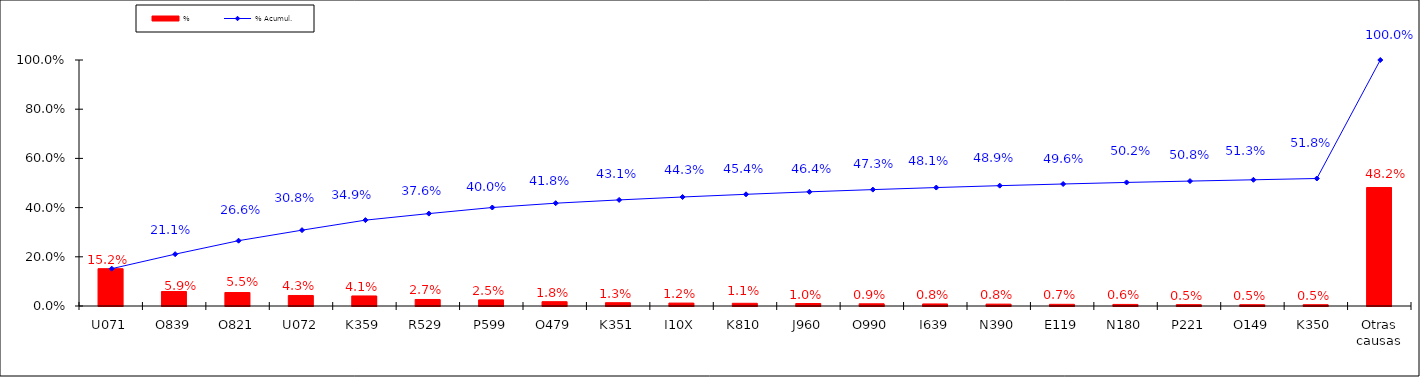
| Category | % |
|---|---|
| U071 | 0.152 |
| O839 | 0.059 |
| O821 | 0.055 |
| U072 | 0.043 |
| K359 | 0.041 |
| R529 | 0.027 |
| P599 | 0.025 |
| O479 | 0.018 |
| K351 | 0.013 |
| I10X | 0.012 |
| K810 | 0.011 |
| J960 | 0.01 |
| O990 | 0.009 |
| I639 | 0.008 |
| N390 | 0.008 |
| E119 | 0.007 |
| N180 | 0.006 |
| P221 | 0.005 |
| O149 | 0.005 |
| K350 | 0.005 |
| Otras causas | 0.482 |